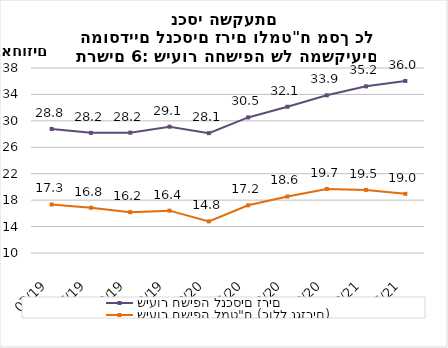
| Category | שיעור חשיפה לנכסים זרים | שיעור חשיפה למט"ח (כולל נגזרים) |
|---|---|---|
| 2019-03-31 | 28.777 | 17.341 |
| 2019-06-30 | 28.185 | 16.849 |
| 2019-09-30 | 28.21 | 16.182 |
| 2019-12-31 | 29.112 | 16.409 |
| 2020-03-31 | 28.139 | 14.784 |
| 2020-06-30 | 30.521 | 17.219 |
| 2020-09-30 | 32.138 | 18.557 |
| 2020-12-31 | 33.869 | 19.696 |
| 2021-03-31 | 35.225 | 19.548 |
| 2021-06-30 | 36.037 | 18.952 |